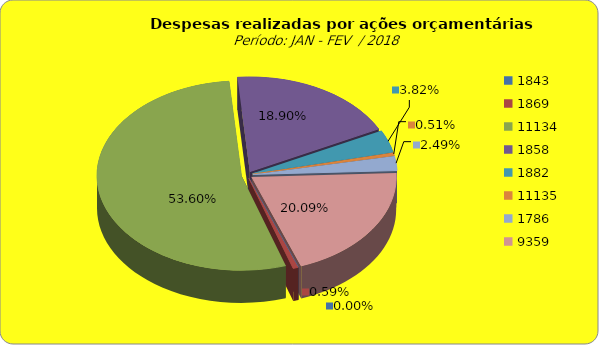
| Category | Series 1 |
|---|---|
| 1843.0 | 0 |
| 1869.0 | 318076.48 |
| 11134.0 | 28896252.11 |
| 1858.0 | 10189503.43 |
| 1882.0 | 2059366.01 |
| 11135.0 | 277318.68 |
| 1786.0 | 1340581.08 |
| 9359.0 | 10833395.82 |